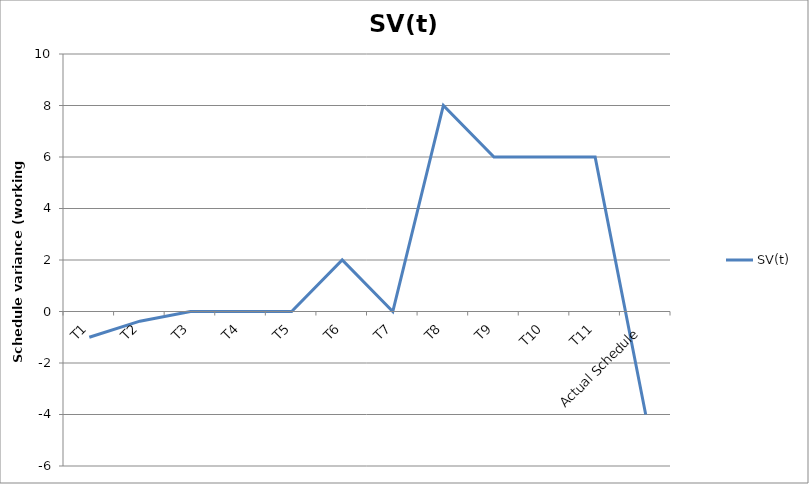
| Category | SV(t) |
|---|---|
| T1 | -1 |
| T2 | -0.375 |
| T3 | 0 |
| T4 | 0 |
| T5 | 0 |
| T6 | 2 |
| T7 | 0 |
| T8 | 8 |
| T9 | 6 |
| T10 | 6 |
| T11 | 6 |
| Actual Schedule | -4 |